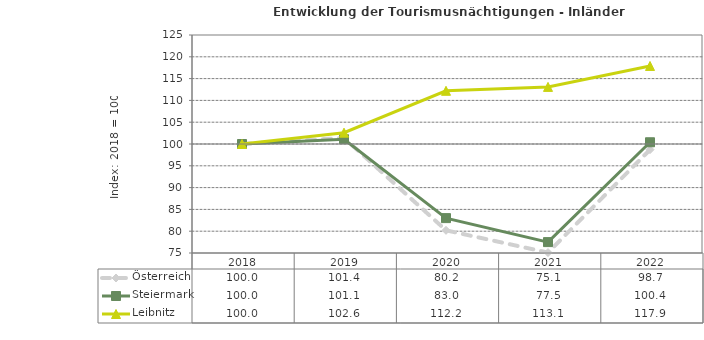
| Category | Österreich | Steiermark | Leibnitz |
|---|---|---|---|
| 2022.0 | 98.7 | 100.4 | 117.9 |
| 2021.0 | 75.1 | 77.5 | 113.1 |
| 2020.0 | 80.2 | 83 | 112.2 |
| 2019.0 | 101.4 | 101.1 | 102.6 |
| 2018.0 | 100 | 100 | 100 |